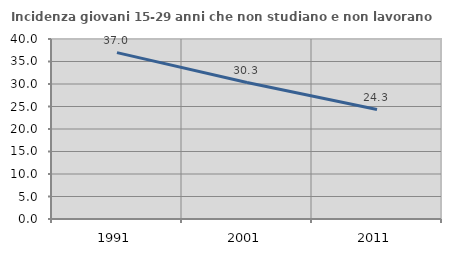
| Category | Incidenza giovani 15-29 anni che non studiano e non lavorano  |
|---|---|
| 1991.0 | 36.965 |
| 2001.0 | 30.318 |
| 2011.0 | 24.32 |